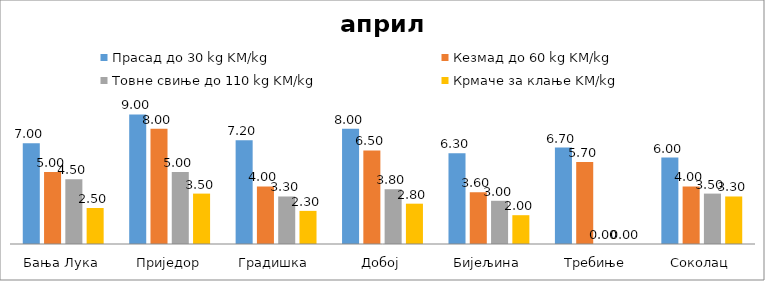
| Category | Прасад до 30 kg KM/kg | Кезмад до 60 kg KM/kg | Товне свиње до 110 kg KM/kg | Крмаче за клање KM/kg |
|---|---|---|---|---|
| Бања Лука | 7 | 5 | 4.5 | 2.5 |
| Приједор | 9 | 8 | 5 | 3.5 |
| Градишка | 7.2 | 4 | 3.3 | 2.3 |
| Добој | 8 | 6.5 | 3.8 | 2.8 |
| Бијељина | 6.3 | 3.6 | 3 | 2 |
|  Требиње | 6.7 | 5.7 | 0 | 0 |
| Соколац | 6 | 4 | 3.5 | 3.3 |